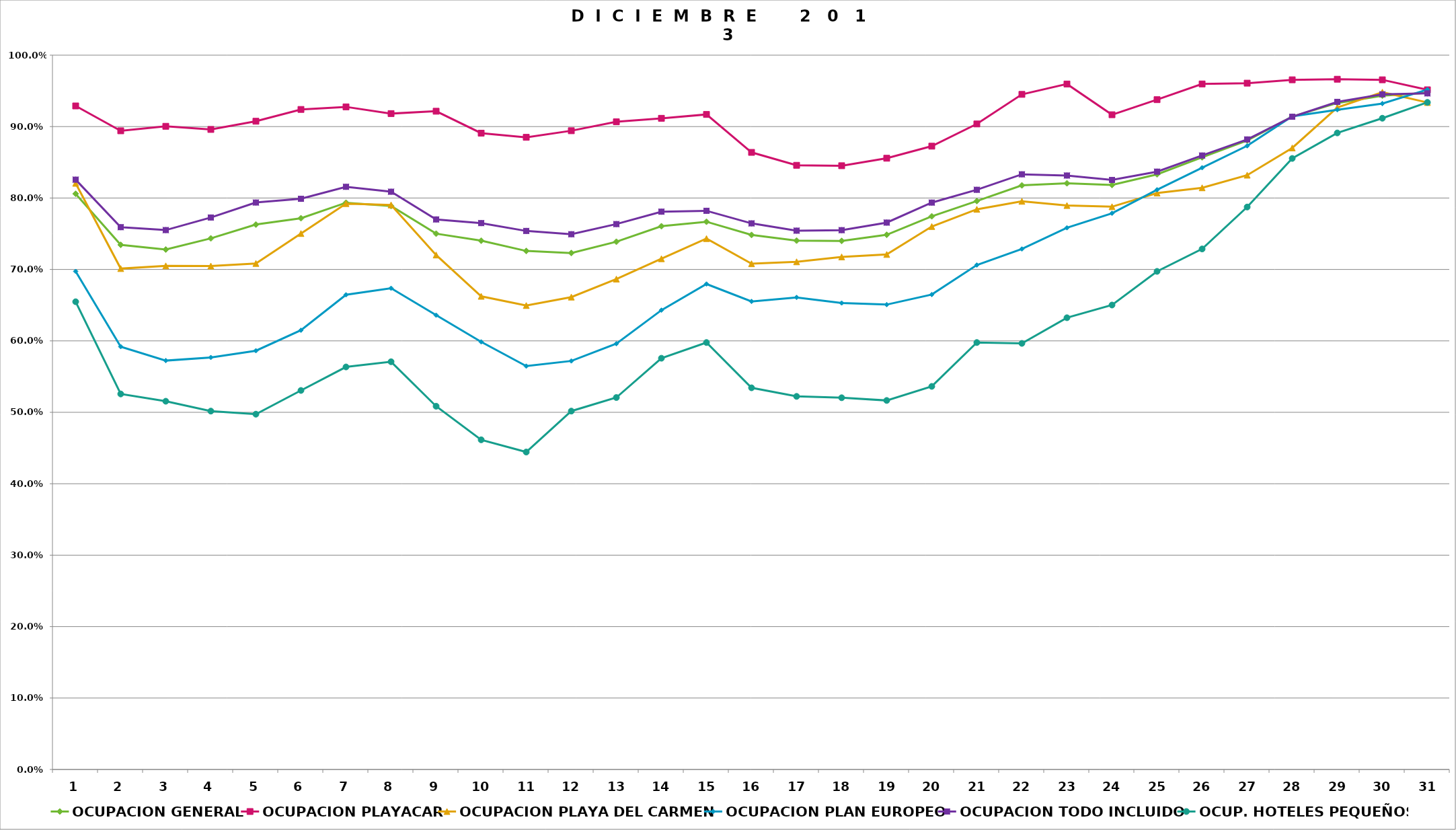
| Category | OCUPACION GENERAL | OCUPACION PLAYACAR | OCUPACION PLAYA DEL CARMEN | OCUPACION PLAN EUROPEO | OCUPACION TODO INCLUIDO | OCUP. HOTELES PEQUEÑOS |
|---|---|---|---|---|---|---|
| 1.0 | 0.806 | 0.929 | 0.821 | 0.697 | 0.826 | 0.655 |
| 2.0 | 0.734 | 0.894 | 0.701 | 0.592 | 0.759 | 0.526 |
| 3.0 | 0.728 | 0.9 | 0.705 | 0.572 | 0.755 | 0.516 |
| 4.0 | 0.744 | 0.896 | 0.705 | 0.577 | 0.773 | 0.502 |
| 5.0 | 0.763 | 0.908 | 0.708 | 0.586 | 0.794 | 0.497 |
| 6.0 | 0.772 | 0.924 | 0.75 | 0.615 | 0.799 | 0.531 |
| 7.0 | 0.793 | 0.928 | 0.792 | 0.664 | 0.816 | 0.564 |
| 8.0 | 0.789 | 0.918 | 0.79 | 0.674 | 0.809 | 0.571 |
| 9.0 | 0.75 | 0.922 | 0.72 | 0.636 | 0.77 | 0.508 |
| 10.0 | 0.74 | 0.891 | 0.662 | 0.599 | 0.765 | 0.462 |
| 11.0 | 0.726 | 0.885 | 0.65 | 0.565 | 0.754 | 0.444 |
| 12.0 | 0.723 | 0.894 | 0.661 | 0.572 | 0.749 | 0.502 |
| 13.0 | 0.739 | 0.907 | 0.686 | 0.596 | 0.764 | 0.521 |
| 14.0 | 0.76 | 0.912 | 0.715 | 0.643 | 0.781 | 0.576 |
| 15.0 | 0.767 | 0.917 | 0.743 | 0.68 | 0.782 | 0.598 |
| 16.0 | 0.748 | 0.864 | 0.708 | 0.655 | 0.764 | 0.534 |
| 17.0 | 0.74 | 0.846 | 0.711 | 0.661 | 0.754 | 0.522 |
| 18.0 | 0.74 | 0.845 | 0.718 | 0.653 | 0.755 | 0.52 |
| 19.0 | 0.748 | 0.856 | 0.721 | 0.651 | 0.766 | 0.517 |
| 20.0 | 0.774 | 0.873 | 0.76 | 0.665 | 0.794 | 0.536 |
| 21.0 | 0.796 | 0.904 | 0.784 | 0.706 | 0.812 | 0.598 |
| 22.0 | 0.818 | 0.945 | 0.795 | 0.729 | 0.833 | 0.596 |
| 23.0 | 0.821 | 0.96 | 0.79 | 0.758 | 0.832 | 0.632 |
| 24.0 | 0.818 | 0.917 | 0.788 | 0.779 | 0.825 | 0.65 |
| 25.0 | 0.833 | 0.938 | 0.807 | 0.812 | 0.837 | 0.697 |
| 26.0 | 0.857 | 0.96 | 0.814 | 0.842 | 0.86 | 0.729 |
| 27.0 | 0.881 | 0.961 | 0.832 | 0.873 | 0.882 | 0.787 |
| 28.0 | 0.914 | 0.966 | 0.87 | 0.914 | 0.914 | 0.855 |
| 29.0 | 0.933 | 0.966 | 0.927 | 0.924 | 0.935 | 0.891 |
| 30.0 | 0.943 | 0.966 | 0.948 | 0.932 | 0.945 | 0.912 |
| 31.0 | 0.947 | 0.952 | 0.934 | 0.952 | 0.946 | 0.934 |